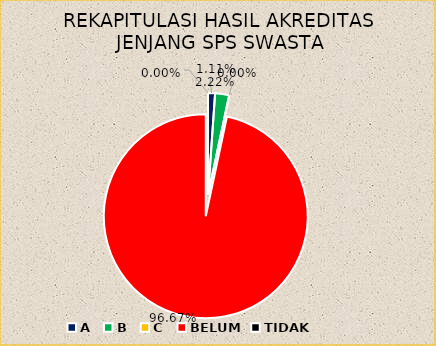
| Category | REKAPITULASI HASIL AKREDITASI JENJANG SPS SWASTA |
|---|---|
| A | 1 |
| B | 2 |
| C | 0 |
| BELUM | 87 |
| TIDAK | 0 |